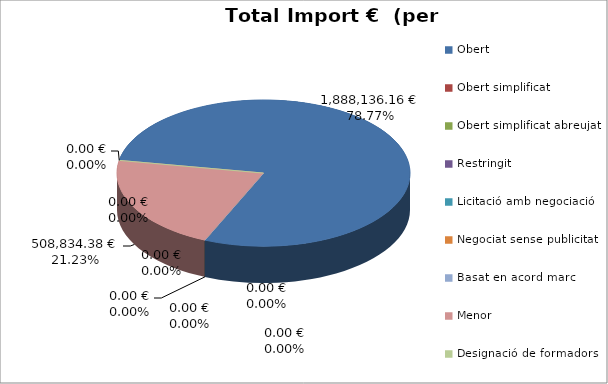
| Category | Total preu              (amb iva) |
|---|---|
| Obert | 1888136.16 |
| Obert simplificat | 0 |
| Obert simplificat abreujat | 0 |
| Restringit | 0 |
| Licitació amb negociació | 0 |
| Negociat sense publicitat | 0 |
| Basat en acord marc | 0 |
| Menor | 508834.38 |
| Designació de formadors | 0 |